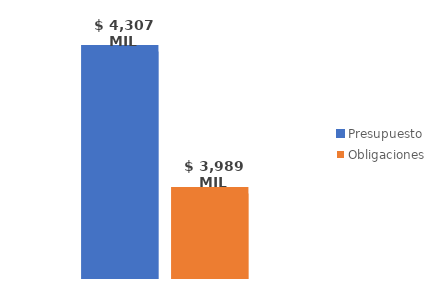
| Category | Presupuesto | Obligaciones |
|---|---|---|
| Total | 4306976052679.682 | 3989252685261.158 |